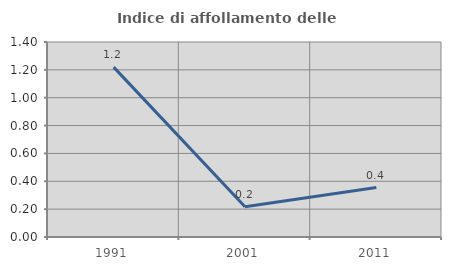
| Category | Indice di affollamento delle abitazioni  |
|---|---|
| 1991.0 | 1.22 |
| 2001.0 | 0.217 |
| 2011.0 | 0.355 |